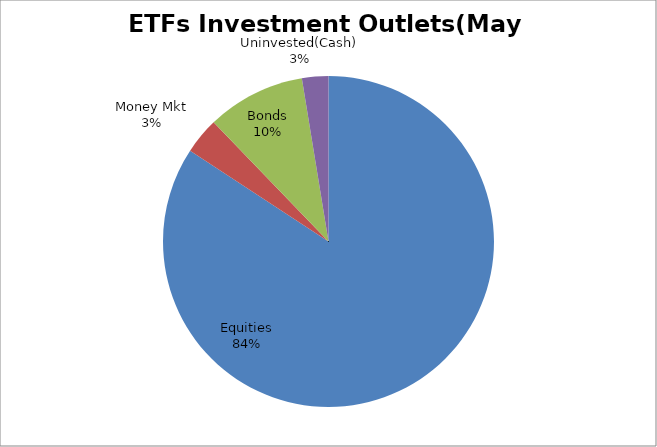
| Category | Series 0 |
|---|---|
| Equities | 4099532871.38 |
| Money Mkt | 172710343.84 |
| Bonds | 468805980.48 |
| Uninvested(Cash) | 125439511.89 |